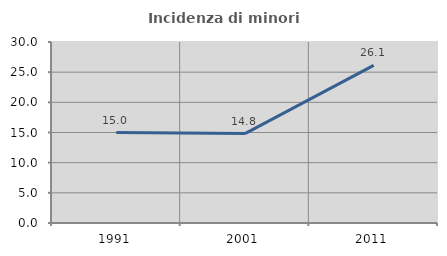
| Category | Incidenza di minori stranieri |
|---|---|
| 1991.0 | 15 |
| 2001.0 | 14.815 |
| 2011.0 | 26.126 |